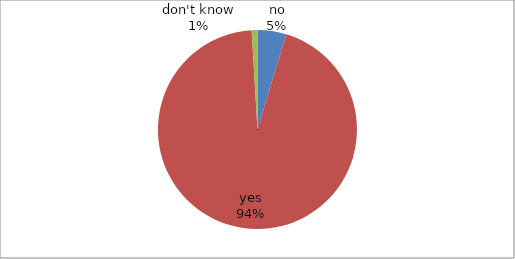
| Category | Series 0 |
|---|---|
| no | 5 |
| yes | 101 |
| don't know | 1 |